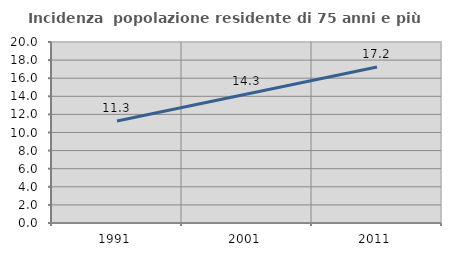
| Category | Incidenza  popolazione residente di 75 anni e più |
|---|---|
| 1991.0 | 11.265 |
| 2001.0 | 14.261 |
| 2011.0 | 17.232 |